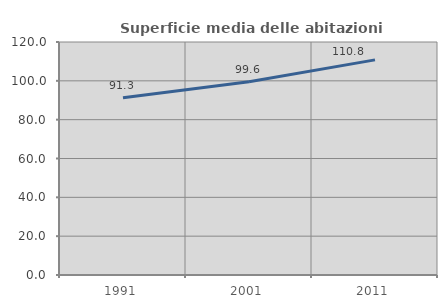
| Category | Superficie media delle abitazioni occupate |
|---|---|
| 1991.0 | 91.342 |
| 2001.0 | 99.554 |
| 2011.0 | 110.787 |